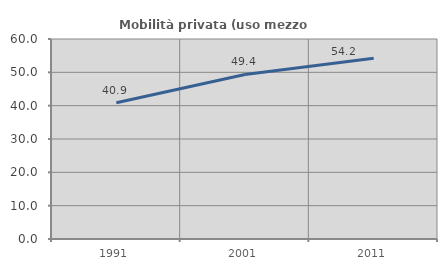
| Category | Mobilità privata (uso mezzo privato) |
|---|---|
| 1991.0 | 40.876 |
| 2001.0 | 49.356 |
| 2011.0 | 54.212 |